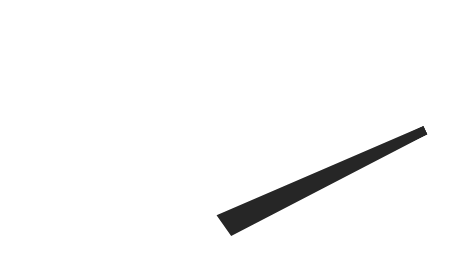
| Category | y |
|---|---|
| 93.25718926358746 | 25.076 |
| 51.003047817017055 | -1.73 |
| 48.996952182982945 | 1.73 |
| 93.25718926358746 | 25.076 |
| 50.0 | 0 |